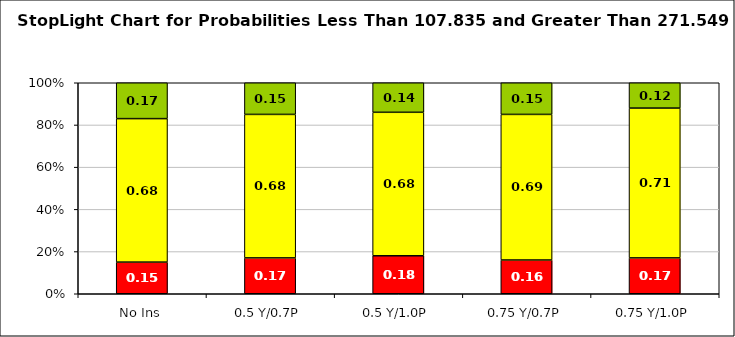
| Category | Series 0 | Series 1 | Series 2 |
|---|---|---|---|
| No Ins | 0.15 | 0.68 | 0.17 |
| 0.5 Y/0.7P | 0.17 | 0.68 | 0.15 |
| 0.5 Y/1.0P | 0.18 | 0.68 | 0.14 |
| 0.75 Y/0.7P | 0.16 | 0.69 | 0.15 |
| 0.75 Y/1.0P | 0.17 | 0.71 | 0.12 |